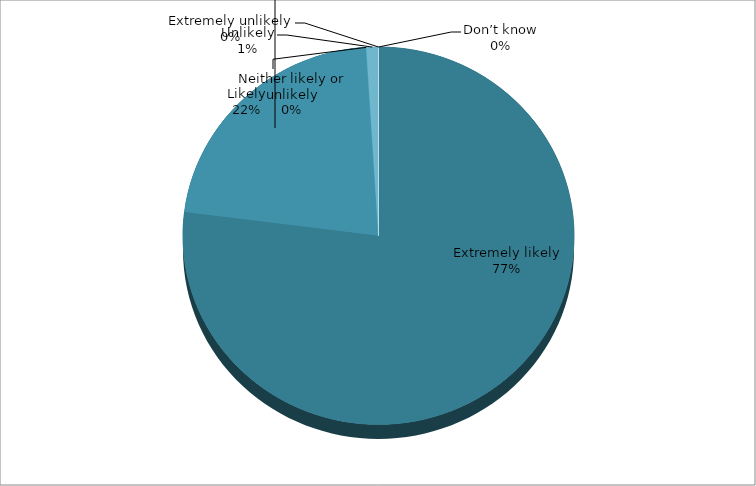
| Category | Series 0 |
|---|---|
| Extremely likely | 77 |
| Likely | 22 |
| Neither likely or unlikely | 0 |
| Unlikely | 1 |
| Extremely unlikely | 0 |
| Don’t know | 0 |